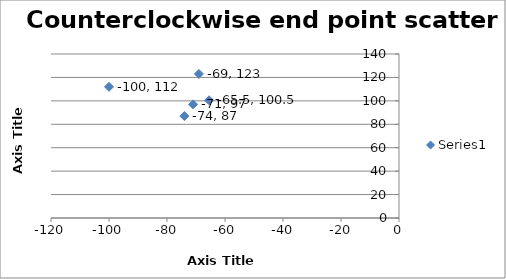
| Category | Series 0 |
|---|---|
| -71.0 | 97 |
| -100.0 | 112 |
| -74.0 | 87 |
| -69.0 | 123 |
| -65.5 | 100.5 |